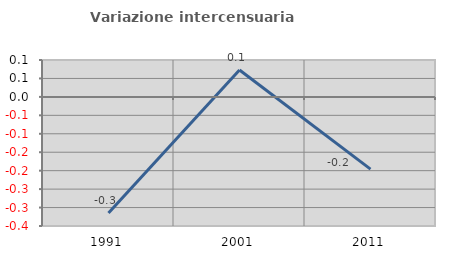
| Category | Variazione intercensuaria annua |
|---|---|
| 1991.0 | -0.315 |
| 2001.0 | 0.073 |
| 2011.0 | -0.196 |